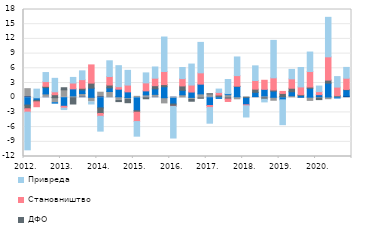
| Category | Непрофитне и друге организације | Локални ниво власти | Готов новац у oптицају | ДФО | Становништво | Привреда  |
|---|---|---|---|---|---|---|
| 2012. | 0.202 | 1.641 | -1.502 | -0.756 | -0.691 | -7.686 |
| II | 0.002 | -0.188 | -0.341 | -0.312 | -0.998 | 1.747 |
| III | 0.11 | 0.664 | 1.273 | 0.274 | 0.972 | 1.84 |
| IV | -0.138 | -0.873 | -0.098 | 0.61 | 0.594 | 2.749 |
| 2013. | 0.079 | 1.527 | -1.754 | 0.426 | -0.373 | -0.296 |
| II | 0.059 | 0.305 | 1.437 | -1.286 | 1.19 | 1.148 |
| III | 0.165 | 0.682 | 0.754 | 0.325 | 1.76 | 1.79 |
| IV | 0.076 | -0.87 | 1.873 | 1.027 | 3.718 | -0.415 |
| 2014. | 0.199 | 0.924 | -2.085 | -1.142 | -0.569 | -3.023 |
| II | 0.035 | 1.231 | 0.74 | 0.578 | 1.742 | 3.202 |
| III | 0.178 | -0.545 | 1.556 | -0.251 | 0.516 | 4.284 |
| IV | -0.104 | -0.237 | 1.19 | -0.68 | 1.391 | 3 |
| 2015. | -0.031 | 0.277 | -2.623 | -0.313 | -1.902 | -2.981 |
| II | 0.129 | 0.455 | 0.809 | -0.218 | 1.631 | 2.039 |
| III | 0.145 | 0.535 | 1.129 | 0.641 | 1.533 | 2.287 |
| IV | -0.109 | -1.155 | 2.237 | 0.437 | 2.676 | 7.032 |
| 2016. | 0.104 | -0.104 | -1.193 | -0.452 | -0.054 | -6.424 |
| II | -0.033 | 0.597 | 0.912 | 0.894 | 1.489 | 2.276 |
| III | 0.058 | -0.277 | 1.097 | -0.443 | 1.429 | 4.281 |
| IV | -0.001 | 0.781 | 1.984 | -0.118 | 2.31 | 6.213 |
| 2017. | 0.133 | 0.64 | -1.599 | 0.025 | -0.411 | -3.193 |
| II | 0.059 | 0.207 | -0.138 | 0.273 | 0.541 | 0.678 |
| III | 0.02 | 0.6 | 0.199 | -0.281 | -0.487 | 2.895 |
| IV | 0.183 | -0.435 | 2.116 | 0.066 | 2.148 | 3.798 |
| 2018. | -0.069 | 0.088 | -1.382 | 0.022 | -0.202 | -2.284 |
| II | 0.083 | 0.156 | 0.854 | 0.654 | 1.762 | 2.986 |
| III | 0.089 | 0.272 | 1.347 | -0.301 | 1.848 | -0.557 |
| IV | 0.082 | -0.727 | 1.258 | 0.234 | 2.481 | 7.641 |
| 2019. | 0.187 | 0.021 | -0.439 | 0.661 | 0.411 | -5.065 |
| II | -0.015 | 0.395 | 0.82 | 0.717 | 1.911 | 1.934 |
| III | 0.109 | -0.155 | 0.363 | 0.139 | 1.592 | 3.965 |
| IV | 0.106 | -0.756 | 1.801 | 0.269 | 3.171 | 3.974 |
| 2020. | -0.044 | 0.196 | 0.422 | -0.345 | 0.62 | 1.138 |
| II | 0.14 | -0.412 | 2.831 | 0.621 | 4.751 | 8.057 |
| III | 0.136 | 0.188 | -0.059 | 0.127 | 1.713 | 2.143 |
| IV | 0.323 | 0.01 | 1.277 | 0.077 | 2.288 | 2.209 |